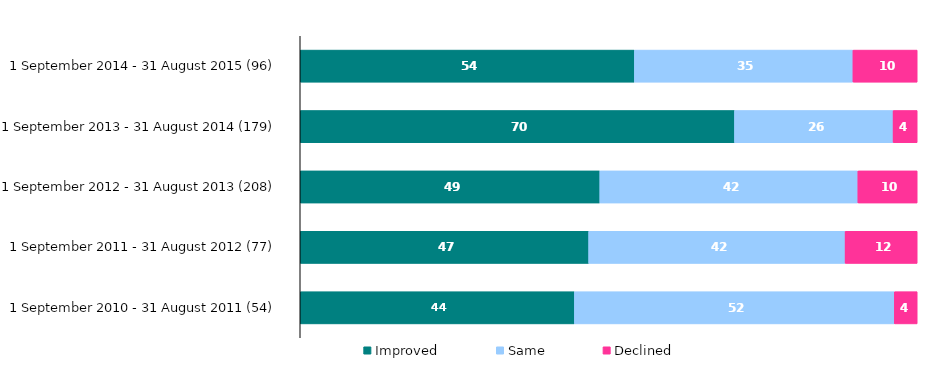
| Category | Improved | Same | Declined |
|---|---|---|---|
| 1 September 2014 - 31 August 2015 (96) | 54.167 | 35.417 | 10.417 |
| 1 September 2013 - 31 August 2014 (179) | 70.391 | 25.698 | 3.911 |
| 1 September 2012 - 31 August 2013 (208) | 48.558 | 41.827 | 9.615 |
| 1 September 2011 - 31 August 2012 (77) | 46.753 | 41.558 | 11.688 |
| 1 September 2010 - 31 August 2011 (54) | 44.444 | 51.852 | 3.704 |